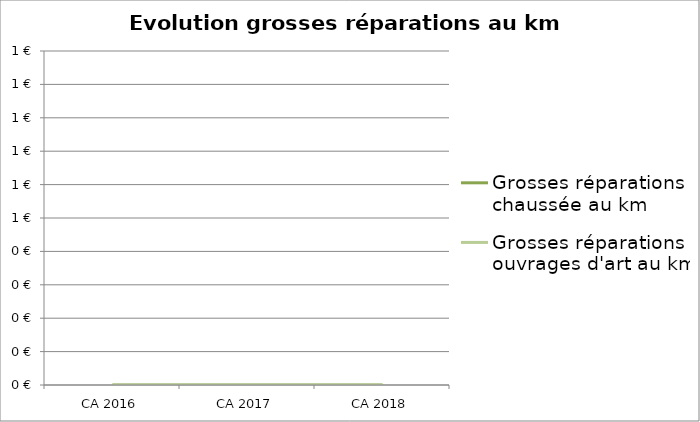
| Category | Grosses réparations chaussée au km | Grosses réparations ouvrages d'art au km |
|---|---|---|
| CA 2016 | 0 | 0 |
| CA 2017 | 0 | 0 |
| CA 2018 | 0 | 0 |